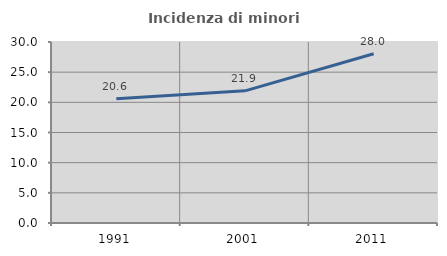
| Category | Incidenza di minori stranieri |
|---|---|
| 1991.0 | 20.588 |
| 2001.0 | 21.905 |
| 2011.0 | 28.049 |